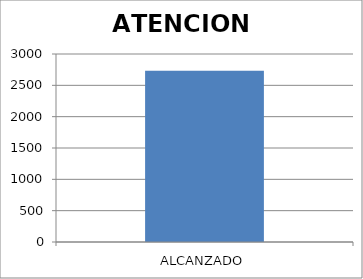
| Category | ATENCION BRINDADA |
|---|---|
| ALCANZADO | 2734 |